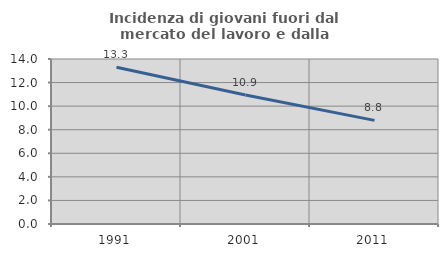
| Category | Incidenza di giovani fuori dal mercato del lavoro e dalla formazione  |
|---|---|
| 1991.0 | 13.301 |
| 2001.0 | 10.94 |
| 2011.0 | 8.79 |